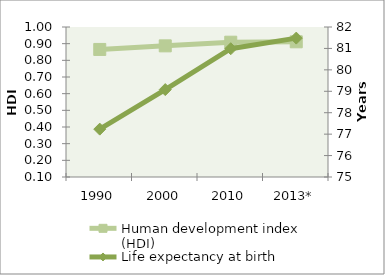
| Category | Human development index (HDI) |
|---|---|
| 1990 | 0.865 |
| 2000 | 0.887 |
| 2010 | 0.909 |
| 2013* | 0.911 |